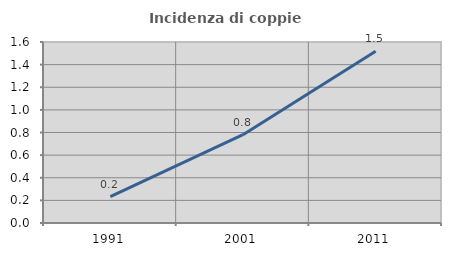
| Category | Incidenza di coppie miste |
|---|---|
| 1991.0 | 0.233 |
| 2001.0 | 0.78 |
| 2011.0 | 1.518 |